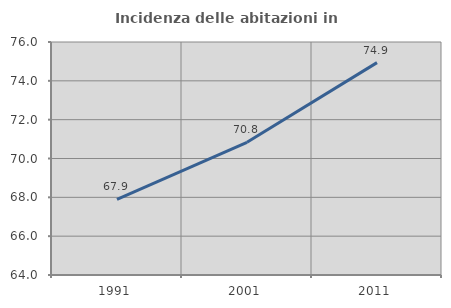
| Category | Incidenza delle abitazioni in proprietà  |
|---|---|
| 1991.0 | 67.891 |
| 2001.0 | 70.833 |
| 2011.0 | 74.938 |